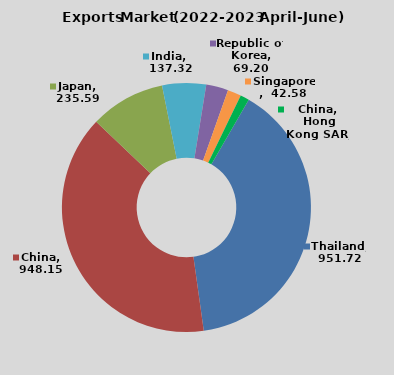
| Category | Series 0 |
|---|---|
| Thailand | 951.72 |
| China | 948.15 |
| Japan | 235.59 |
| India | 137.32 |
| Republic of  Korea | 69.2 |
| Singapore | 42.58 |
| China, Hong Kong SAR | 27.92 |